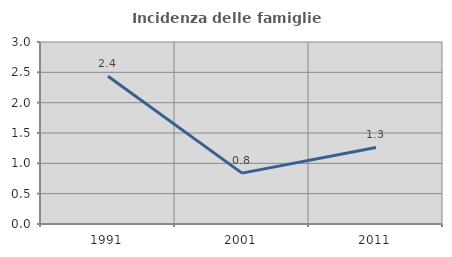
| Category | Incidenza delle famiglie numerose |
|---|---|
| 1991.0 | 2.435 |
| 2001.0 | 0.839 |
| 2011.0 | 1.261 |